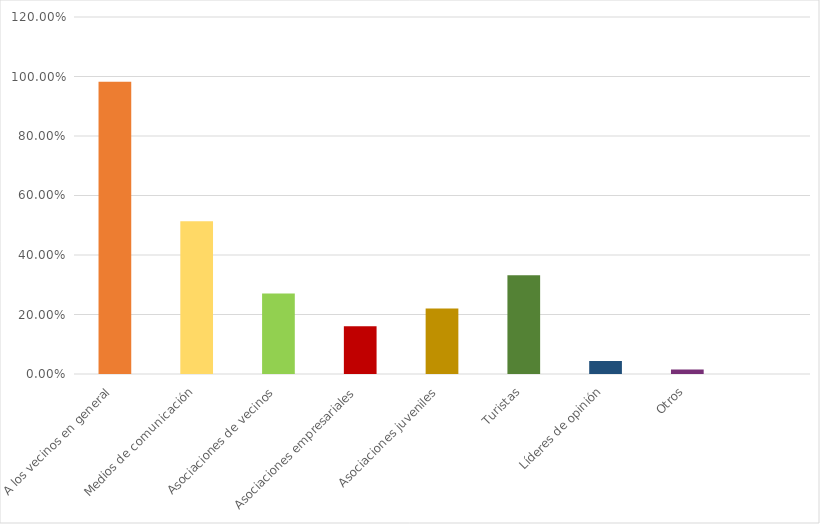
| Category | Series 0 |
|---|---|
| A los vecinos en general | 0.982 |
| Medios de comunicación | 0.513 |
| Asociaciones de vecinos | 0.271 |
| Asociaciones empresariales | 0.16 |
| Asociaciones juveniles | 0.22 |
| Turistas | 0.332 |
| Líderes de opinión | 0.043 |
| Otros | 0.015 |